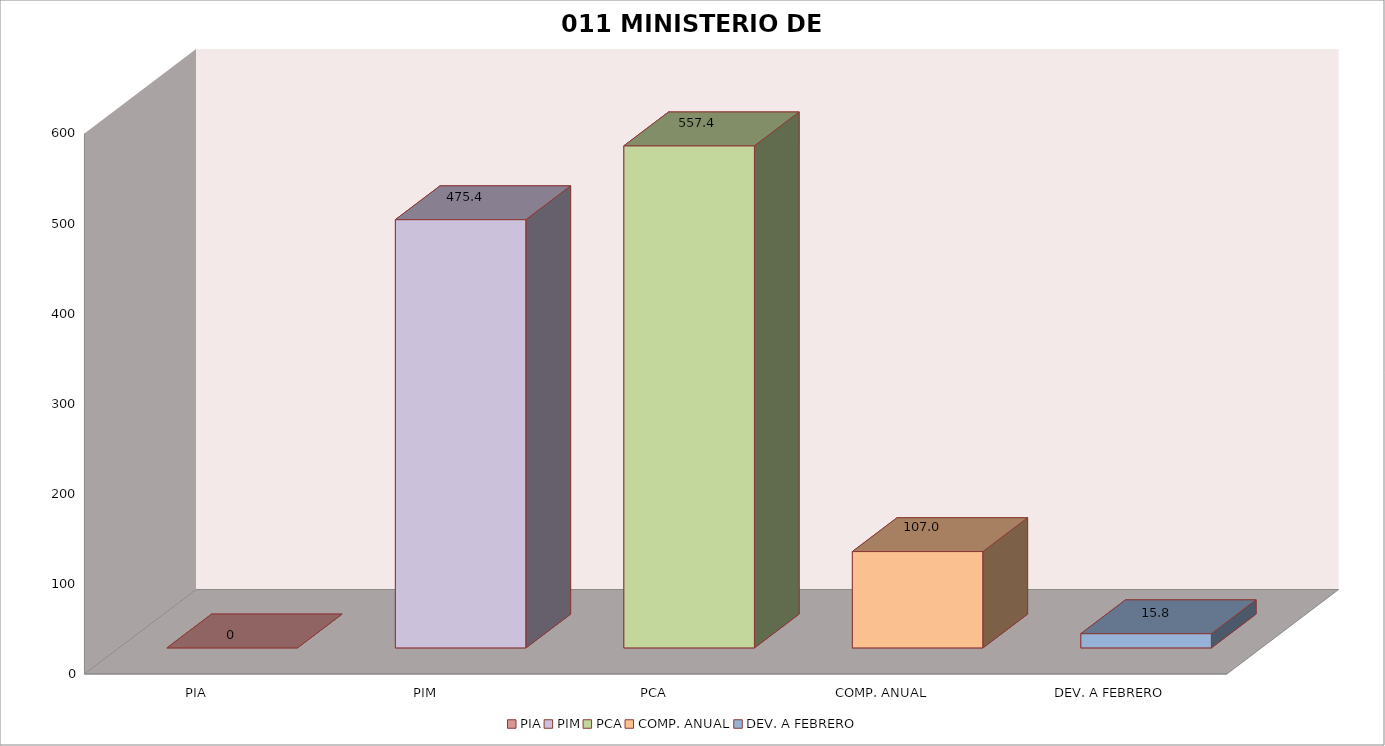
| Category | 011 MINISTERIO DE SALUD |
|---|---|
| PIA | 0 |
| PIM | 475.409 |
| PCA | 557.377 |
| COMP. ANUAL | 106.962 |
| DEV. A FEBRERO | 15.837 |